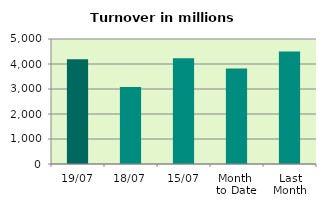
| Category | Series 0 |
|---|---|
| 19/07 | 4188.197 |
| 18/07 | 3079.229 |
| 15/07 | 4231.958 |
| Month 
to Date | 3822.99 |
| Last
Month | 4502.251 |